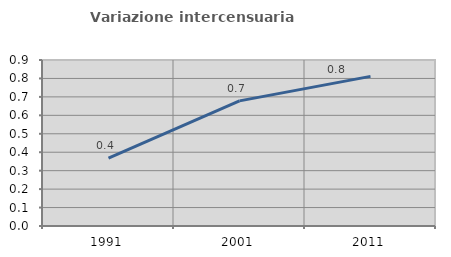
| Category | Variazione intercensuaria annua |
|---|---|
| 1991.0 | 0.367 |
| 2001.0 | 0.678 |
| 2011.0 | 0.811 |